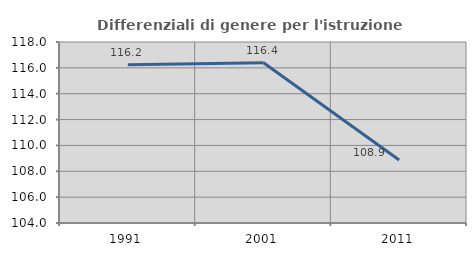
| Category | Differenziali di genere per l'istruzione superiore |
|---|---|
| 1991.0 | 116.24 |
| 2001.0 | 116.398 |
| 2011.0 | 108.879 |